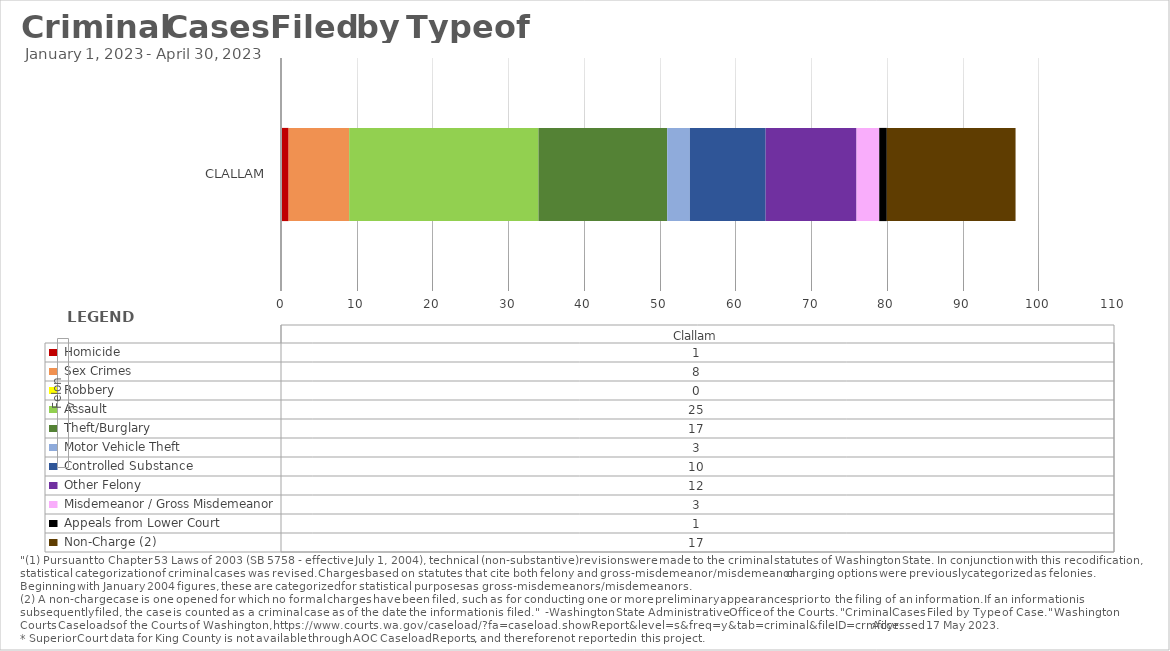
| Category |  Homicide  |  Sex Crimes  |  Robbery  |  Assault  |  Theft/Burglary  |  Motor Vehicle Theft  |  Controlled Substance  |  Other Felony  |  Misdemeanor / Gross Misdemeanor  |  Appeals from Lower Court  |  Non-Charge (2)  |
|---|---|---|---|---|---|---|---|---|---|---|---|
| Clallam | 1 | 8 | 0 | 25 | 17 | 3 | 10 | 12 | 3 | 1 | 17 |